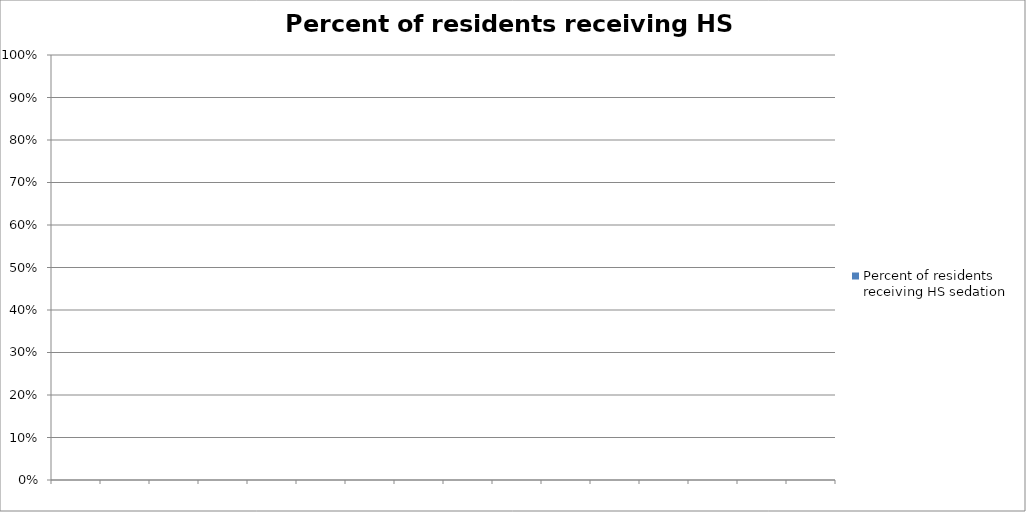
| Category | Percent of residents receiving HS sedation |
|---|---|
|  | 0 |
|  | 0 |
|  | 0 |
|  | 0 |
|  | 0 |
|  | 0 |
|  | 0 |
|  | 0 |
|  | 0 |
|  | 0 |
|  | 0 |
|  | 0 |
|  | 0 |
|  | 0 |
|  | 0 |
|  | 0 |